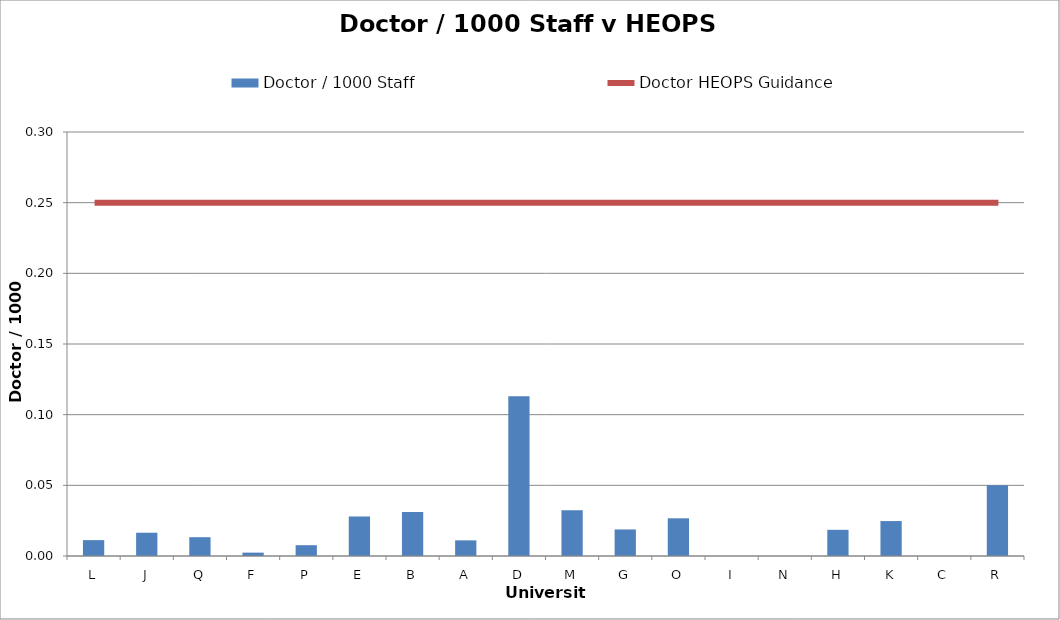
| Category | Doctor / 1000 Staff  |
|---|---|
| L | 0.011 |
| J | 0.016 |
| Q | 0.013 |
| F | 0.002 |
| P | 0.008 |
| E | 0.028 |
| B | 0.031 |
| A | 0.011 |
| D | 0.113 |
| M | 0.032 |
| G | 0.019 |
| O | 0.027 |
| I | 0 |
| N | 0 |
| H | 0.019 |
| K | 0.025 |
| C | 0 |
| R | 0.05 |